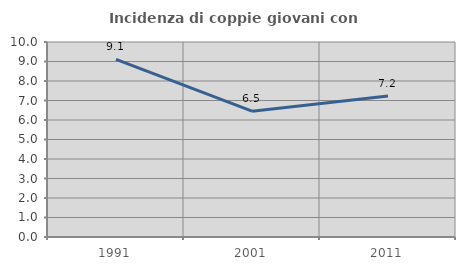
| Category | Incidenza di coppie giovani con figli |
|---|---|
| 1991.0 | 9.113 |
| 2001.0 | 6.452 |
| 2011.0 | 7.235 |